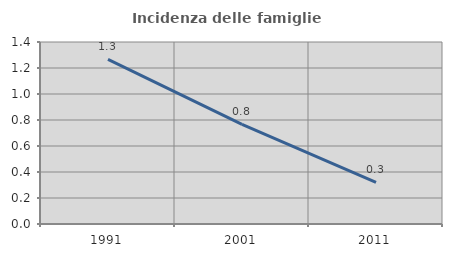
| Category | Incidenza delle famiglie numerose |
|---|---|
| 1991.0 | 1.266 |
| 2001.0 | 0.767 |
| 2011.0 | 0.321 |